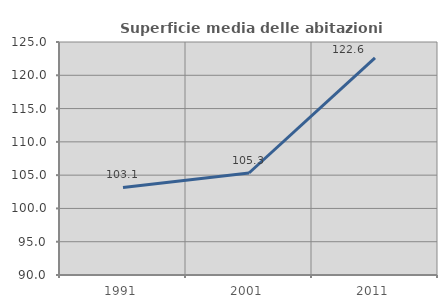
| Category | Superficie media delle abitazioni occupate |
|---|---|
| 1991.0 | 103.149 |
| 2001.0 | 105.323 |
| 2011.0 | 122.6 |